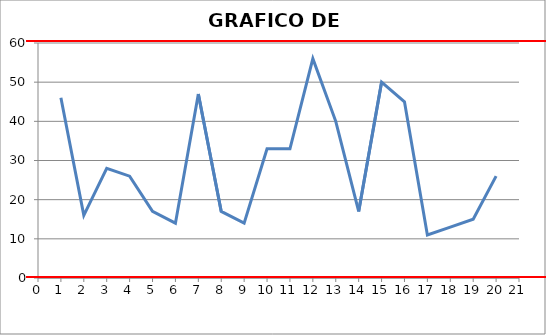
| Category | RANGO |
|---|---|
| 1.0 | 46 |
| 2.0 | 16 |
| 3.0 | 28 |
| 4.0 | 26 |
| 5.0 | 17 |
| 6.0 | 14 |
| 7.0 | 47 |
| 8.0 | 17 |
| 9.0 | 14 |
| 10.0 | 33 |
| 11.0 | 33 |
| 12.0 | 56 |
| 13.0 | 40 |
| 14.0 | 17 |
| 15.0 | 50 |
| 16.0 | 45 |
| 17.0 | 11 |
| 18.0 | 13 |
| 19.0 | 15 |
| 20.0 | 26 |